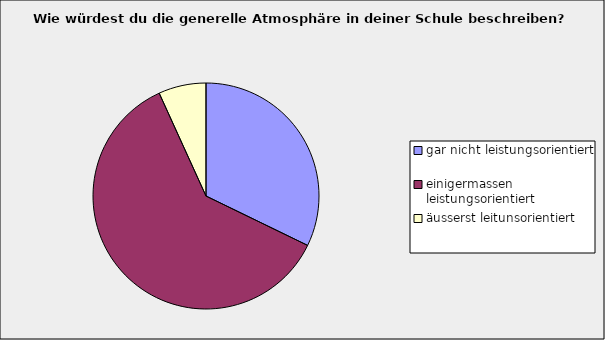
| Category | Series 0 |
|---|---|
| gar nicht leistungsorientiert | 0.322 |
| einigermassen leistungsorientiert | 0.61 |
| äusserst leitunsorientiert | 0.068 |